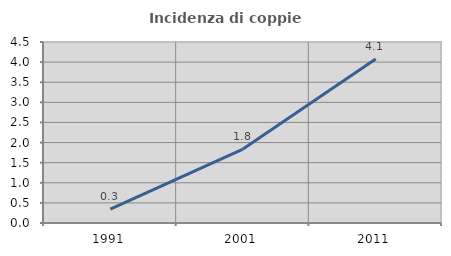
| Category | Incidenza di coppie miste |
|---|---|
| 1991.0 | 0.346 |
| 2001.0 | 1.839 |
| 2011.0 | 4.076 |